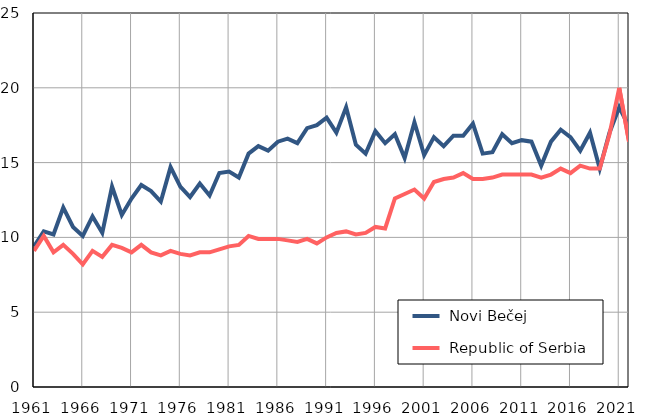
| Category |  Novi Bečej |  Republic of Serbia |
|---|---|---|
| 1961.0 | 9.4 | 9.1 |
| 1962.0 | 10.4 | 10.1 |
| 1963.0 | 10.2 | 9 |
| 1964.0 | 12 | 9.5 |
| 1965.0 | 10.7 | 8.9 |
| 1966.0 | 10.1 | 8.2 |
| 1967.0 | 11.4 | 9.1 |
| 1968.0 | 10.3 | 8.7 |
| 1969.0 | 13.4 | 9.5 |
| 1970.0 | 11.5 | 9.3 |
| 1971.0 | 12.6 | 9 |
| 1972.0 | 13.5 | 9.5 |
| 1973.0 | 13.1 | 9 |
| 1974.0 | 12.4 | 8.8 |
| 1975.0 | 14.7 | 9.1 |
| 1976.0 | 13.4 | 8.9 |
| 1977.0 | 12.7 | 8.8 |
| 1978.0 | 13.6 | 9 |
| 1979.0 | 12.8 | 9 |
| 1980.0 | 14.3 | 9.2 |
| 1981.0 | 14.4 | 9.4 |
| 1982.0 | 14 | 9.5 |
| 1983.0 | 15.6 | 10.1 |
| 1984.0 | 16.1 | 9.9 |
| 1985.0 | 15.8 | 9.9 |
| 1986.0 | 16.4 | 9.9 |
| 1987.0 | 16.6 | 9.8 |
| 1988.0 | 16.3 | 9.7 |
| 1989.0 | 17.3 | 9.9 |
| 1990.0 | 17.5 | 9.6 |
| 1991.0 | 18 | 10 |
| 1992.0 | 17 | 10.3 |
| 1993.0 | 18.7 | 10.4 |
| 1994.0 | 16.2 | 10.2 |
| 1995.0 | 15.6 | 10.3 |
| 1996.0 | 17.1 | 10.7 |
| 1997.0 | 16.3 | 10.6 |
| 1998.0 | 16.9 | 12.6 |
| 1999.0 | 15.3 | 12.9 |
| 2000.0 | 17.7 | 13.2 |
| 2001.0 | 15.5 | 12.6 |
| 2002.0 | 16.7 | 13.7 |
| 2003.0 | 16.1 | 13.9 |
| 2004.0 | 16.8 | 14 |
| 2005.0 | 16.8 | 14.3 |
| 2006.0 | 17.6 | 13.9 |
| 2007.0 | 15.6 | 13.9 |
| 2008.0 | 15.7 | 14 |
| 2009.0 | 16.9 | 14.2 |
| 2010.0 | 16.3 | 14.2 |
| 2011.0 | 16.5 | 14.2 |
| 2012.0 | 16.4 | 14.2 |
| 2013.0 | 14.8 | 14 |
| 2014.0 | 16.4 | 14.2 |
| 2015.0 | 17.2 | 14.6 |
| 2016.0 | 16.7 | 14.3 |
| 2017.0 | 15.8 | 14.8 |
| 2018.0 | 17 | 14.6 |
| 2019.0 | 14.6 | 14.6 |
| 2020.0 | 17 | 16.9 |
| 2021.0 | 18.7 | 20 |
| 2022.0 | 17.4 | 16.4 |